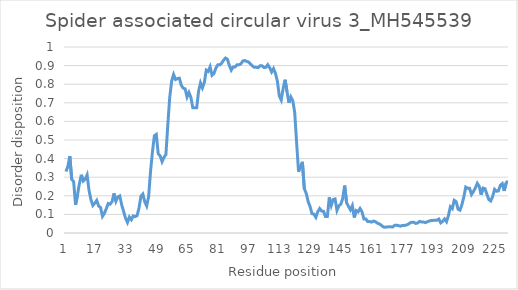
| Category | Series 0 |
|---|---|
| 0 | 0.33 |
| 1 | 0.359 |
| 2 | 0.413 |
| 3 | 0.288 |
| 4 | 0.276 |
| 5 | 0.151 |
| 6 | 0.205 |
| 7 | 0.266 |
| 8 | 0.313 |
| 9 | 0.279 |
| 10 | 0.289 |
| 11 | 0.312 |
| 12 | 0.229 |
| 13 | 0.18 |
| 14 | 0.148 |
| 15 | 0.16 |
| 16 | 0.175 |
| 17 | 0.145 |
| 18 | 0.137 |
| 19 | 0.089 |
| 20 | 0.106 |
| 21 | 0.131 |
| 22 | 0.159 |
| 23 | 0.155 |
| 24 | 0.169 |
| 25 | 0.213 |
| 26 | 0.171 |
| 27 | 0.194 |
| 28 | 0.199 |
| 29 | 0.151 |
| 30 | 0.116 |
| 31 | 0.079 |
| 32 | 0.057 |
| 33 | 0.085 |
| 34 | 0.072 |
| 35 | 0.092 |
| 36 | 0.088 |
| 37 | 0.093 |
| 38 | 0.134 |
| 39 | 0.198 |
| 40 | 0.209 |
| 41 | 0.167 |
| 42 | 0.145 |
| 43 | 0.195 |
| 44 | 0.33 |
| 45 | 0.436 |
| 46 | 0.523 |
| 47 | 0.53 |
| 48 | 0.426 |
| 49 | 0.415 |
| 50 | 0.384 |
| 51 | 0.407 |
| 52 | 0.422 |
| 53 | 0.583 |
| 54 | 0.731 |
| 55 | 0.817 |
| 56 | 0.852 |
| 57 | 0.825 |
| 58 | 0.83 |
| 59 | 0.832 |
| 60 | 0.794 |
| 61 | 0.779 |
| 62 | 0.775 |
| 63 | 0.731 |
| 64 | 0.755 |
| 65 | 0.729 |
| 66 | 0.673 |
| 67 | 0.673 |
| 68 | 0.673 |
| 69 | 0.762 |
| 70 | 0.807 |
| 71 | 0.78 |
| 72 | 0.81 |
| 73 | 0.876 |
| 74 | 0.868 |
| 75 | 0.894 |
| 76 | 0.848 |
| 77 | 0.858 |
| 78 | 0.886 |
| 79 | 0.904 |
| 80 | 0.904 |
| 81 | 0.912 |
| 82 | 0.929 |
| 83 | 0.941 |
| 84 | 0.934 |
| 85 | 0.901 |
| 86 | 0.876 |
| 87 | 0.893 |
| 88 | 0.893 |
| 89 | 0.904 |
| 90 | 0.904 |
| 91 | 0.909 |
| 92 | 0.925 |
| 93 | 0.927 |
| 94 | 0.922 |
| 95 | 0.92 |
| 96 | 0.908 |
| 97 | 0.898 |
| 98 | 0.89 |
| 99 | 0.89 |
| 100 | 0.889 |
| 101 | 0.9 |
| 102 | 0.899 |
| 103 | 0.89 |
| 104 | 0.891 |
| 105 | 0.905 |
| 106 | 0.889 |
| 107 | 0.866 |
| 108 | 0.884 |
| 109 | 0.858 |
| 110 | 0.816 |
| 111 | 0.737 |
| 112 | 0.715 |
| 113 | 0.778 |
| 114 | 0.824 |
| 115 | 0.76 |
| 116 | 0.7 |
| 117 | 0.732 |
| 118 | 0.711 |
| 119 | 0.649 |
| 120 | 0.486 |
| 121 | 0.329 |
| 122 | 0.357 |
| 123 | 0.382 |
| 124 | 0.238 |
| 125 | 0.213 |
| 126 | 0.169 |
| 127 | 0.142 |
| 128 | 0.104 |
| 129 | 0.101 |
| 130 | 0.084 |
| 131 | 0.114 |
| 132 | 0.132 |
| 133 | 0.118 |
| 134 | 0.117 |
| 135 | 0.088 |
| 136 | 0.089 |
| 137 | 0.192 |
| 138 | 0.148 |
| 139 | 0.18 |
| 140 | 0.183 |
| 141 | 0.121 |
| 142 | 0.146 |
| 143 | 0.155 |
| 144 | 0.187 |
| 145 | 0.255 |
| 146 | 0.163 |
| 147 | 0.143 |
| 148 | 0.124 |
| 149 | 0.147 |
| 150 | 0.083 |
| 151 | 0.121 |
| 152 | 0.114 |
| 153 | 0.132 |
| 154 | 0.114 |
| 155 | 0.076 |
| 156 | 0.076 |
| 157 | 0.061 |
| 158 | 0.061 |
| 159 | 0.059 |
| 160 | 0.064 |
| 161 | 0.061 |
| 162 | 0.053 |
| 163 | 0.049 |
| 164 | 0.042 |
| 165 | 0.033 |
| 166 | 0.031 |
| 167 | 0.033 |
| 168 | 0.033 |
| 169 | 0.033 |
| 170 | 0.033 |
| 171 | 0.041 |
| 172 | 0.042 |
| 173 | 0.04 |
| 174 | 0.037 |
| 175 | 0.041 |
| 176 | 0.041 |
| 177 | 0.042 |
| 178 | 0.047 |
| 179 | 0.054 |
| 180 | 0.058 |
| 181 | 0.057 |
| 182 | 0.052 |
| 183 | 0.054 |
| 184 | 0.062 |
| 185 | 0.059 |
| 186 | 0.059 |
| 187 | 0.055 |
| 188 | 0.06 |
| 189 | 0.064 |
| 190 | 0.067 |
| 191 | 0.068 |
| 192 | 0.069 |
| 193 | 0.069 |
| 194 | 0.075 |
| 195 | 0.055 |
| 196 | 0.063 |
| 197 | 0.075 |
| 198 | 0.061 |
| 199 | 0.094 |
| 200 | 0.141 |
| 201 | 0.131 |
| 202 | 0.176 |
| 203 | 0.168 |
| 204 | 0.128 |
| 205 | 0.123 |
| 206 | 0.152 |
| 207 | 0.194 |
| 208 | 0.247 |
| 209 | 0.24 |
| 210 | 0.24 |
| 211 | 0.207 |
| 212 | 0.223 |
| 213 | 0.242 |
| 214 | 0.267 |
| 215 | 0.251 |
| 216 | 0.206 |
| 217 | 0.242 |
| 218 | 0.238 |
| 219 | 0.208 |
| 220 | 0.18 |
| 221 | 0.172 |
| 222 | 0.196 |
| 223 | 0.235 |
| 224 | 0.224 |
| 225 | 0.226 |
| 226 | 0.257 |
| 227 | 0.266 |
| 228 | 0.226 |
| 229 | 0.269 |
| 230 | 0.28 |